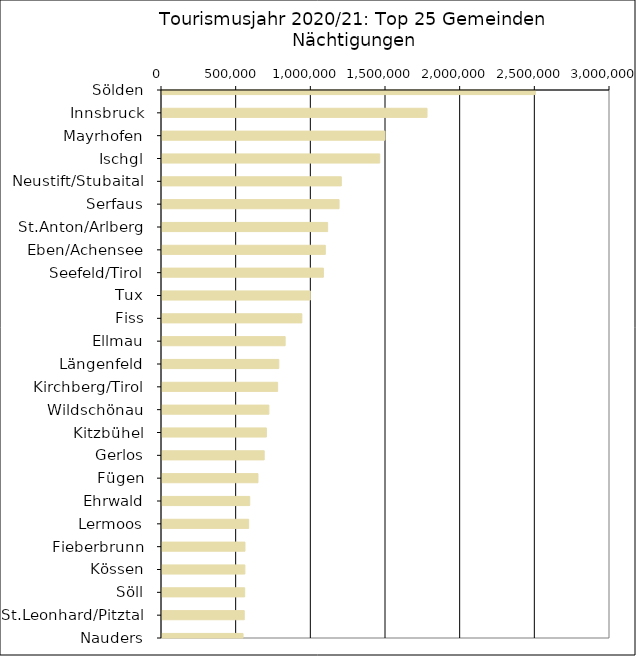
| Category | Series 0 |
|---|---|
| Sölden | 2500874 |
| Innsbruck | 1774730 |
| Mayrhofen | 1492879 |
| Ischgl | 1458111 |
| Neustift/Stubaital | 1200705 |
| Serfaus | 1185652 |
| St.Anton/Arlberg | 1109218 |
| Eben/Achensee | 1093563 |
| Seefeld/Tirol | 1080662 |
| Tux | 993108 |
| Fiss | 936466 |
| Ellmau | 824501 |
| Längenfeld | 782140 |
| Kirchberg/Tirol | 774325 |
| Wildschönau | 715712 |
| Kitzbühel | 698955 |
| Gerlos | 684307 |
| Fügen | 642849 |
| Ehrwald | 587449 |
| Lermoos | 580318 |
| Fieberbrunn | 555584 |
| Kössen | 555017 |
| Söll | 553656 |
| St.Leonhard/Pitztal | 550859 |
| Nauders | 542706 |